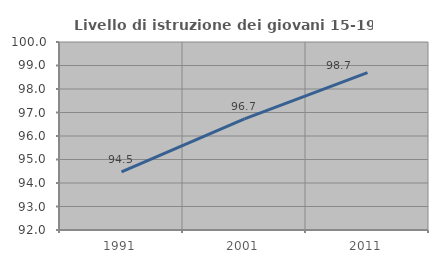
| Category | Livello di istruzione dei giovani 15-19 anni |
|---|---|
| 1991.0 | 94.47 |
| 2001.0 | 96.732 |
| 2011.0 | 98.693 |